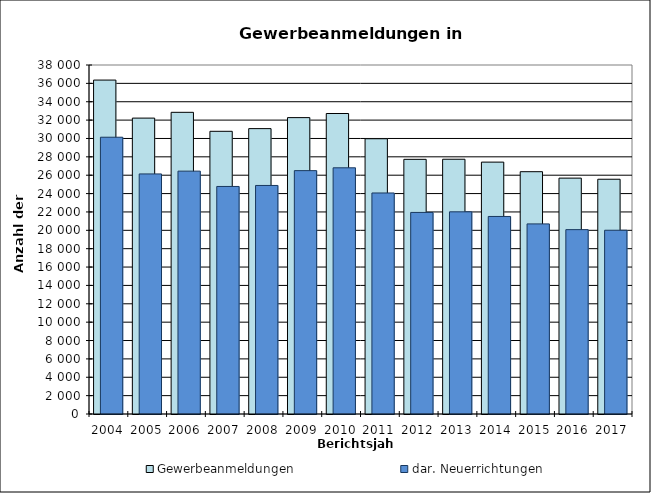
| Category | Gewerbeanmeldungen | dar. Neuerrichtungen |
|---|---|---|
| 2004.0 | 36359 | 30135 |
| 2005.0 | 32219 | 26140 |
| 2006.0 | 32847 | 26444 |
| 2007.0 | 30781 | 24775 |
| 2008.0 | 31074 | 24884 |
| 2009.0 | 32271 | 26499 |
| 2010.0 | 32718 | 26806 |
| 2011.0 | 29971 | 24066 |
| 2012.0 | 27728 | 21948 |
| 2013.0 | 27739 | 22013 |
| 2014.0 | 27426 | 21509 |
| 2015.0 | 26383 | 20698 |
| 2016.0 | 25683 | 20075 |
| 2017.0 | 25561 | 20008 |